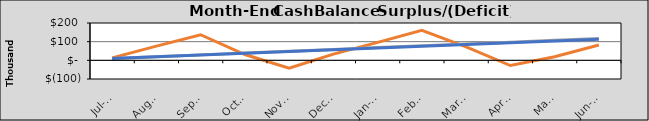
| Category | Final Cash | Original Cash | Revised Cash |
|---|---|---|---|
| 2020-07-01 | 13420.806 | 9746.34 | 9368.558 |
| 2020-08-01 | 76281.612 | 19492.031 | 18737.117 |
| 2020-09-01 | 137217.323 | 29237.723 | 28105.675 |
| 2020-10-02 | 31201.354 | 38983.415 | 37474.233 |
| 2020-11-02 | -42230.46 | 48729.107 | 46842.792 |
| 2020-12-03 | 33020.196 | 58474.798 | 56211.35 |
| 2021-01-03 | 96028.381 | 68220.49 | 65579.908 |
| 2021-02-03 | 160376.562 | 77966.182 | 74948.467 |
| 2021-03-06 | 71749.273 | 87711.874 | 84317.025 |
| 2021-04-06 | -27972.391 | 97457.565 | 93685.583 |
| 2021-05-07 | 19553.555 | 107203.257 | 103054.142 |
| 2021-06-07 | 82017.34 | 116948.949 | 112422.7 |